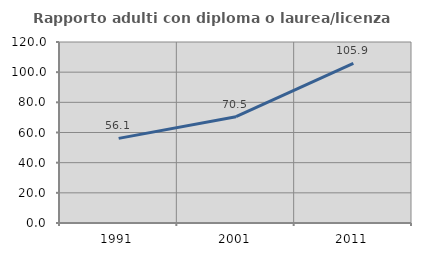
| Category | Rapporto adulti con diploma o laurea/licenza media  |
|---|---|
| 1991.0 | 56.098 |
| 2001.0 | 70.492 |
| 2011.0 | 105.882 |